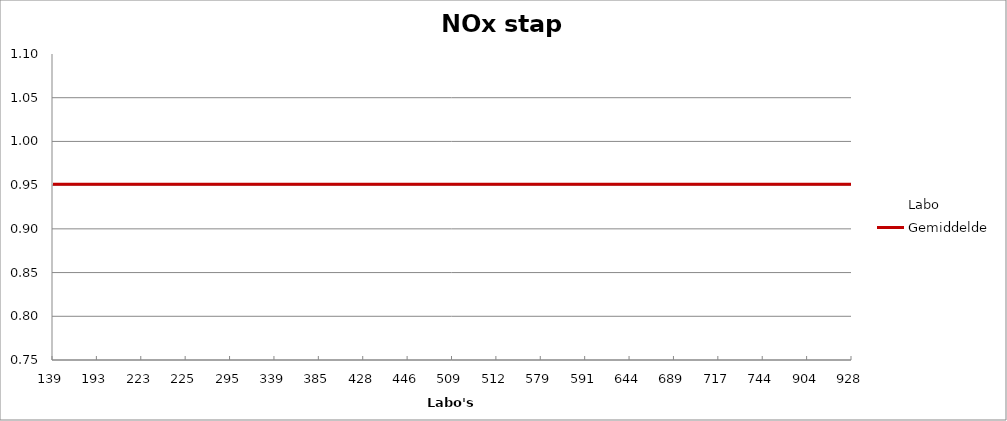
| Category | Labo | Gemiddelde |
|---|---|---|
| 139.0 | 0.973 | 0.951 |
| 193.0 | 0.957 | 0.951 |
| 223.0 | 0.989 | 0.951 |
| 225.0 | 0.941 | 0.951 |
| 295.0 | 0.949 | 0.951 |
| 339.0 | 0.862 | 0.951 |
| 385.0 | 0.957 | 0.951 |
| 428.0 | 1.013 | 0.951 |
| 446.0 | 0.933 | 0.951 |
| 509.0 | 0.925 | 0.951 |
| 512.0 | 0.886 | 0.951 |
| 579.0 | 0.997 | 0.951 |
| 591.0 | 1.045 | 0.951 |
| 644.0 | 1.013 | 0.951 |
| 689.0 | 0.933 | 0.951 |
| 717.0 | 0.757 | 0.951 |
| 744.0 | 0.973 | 0.951 |
| 904.0 | 0.933 | 0.951 |
| 928.0 | 0.917 | 0.951 |